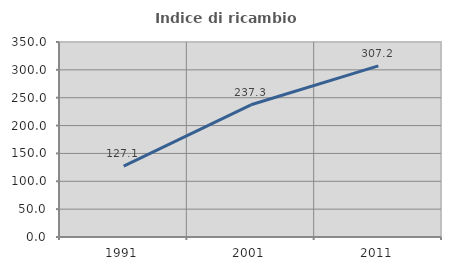
| Category | Indice di ricambio occupazionale  |
|---|---|
| 1991.0 | 127.143 |
| 2001.0 | 237.313 |
| 2011.0 | 307.246 |